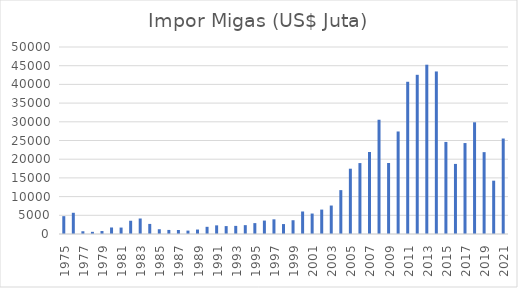
| Category | Impor Migas (US$ Juta) |
|---|---|
| 1975.0 | 4769.8 |
| 1976.0 | 5673.1 |
| 1977.0 | 732 |
| 1978.0 | 579.7 |
| 1979.0 | 793.3 |
| 1980.0 | 1744 |
| 1981.0 | 1721.3 |
| 1982.0 | 3544.8 |
| 1983.0 | 4144.8 |
| 1984.0 | 2696.8 |
| 1985.0 | 1275.6 |
| 1986.0 | 1086.4 |
| 1987.0 | 1067.9 |
| 1988.0 | 909 |
| 1989.0 | 1195.2 |
| 1990.0 | 1920.4 |
| 1991.0 | 2310.3 |
| 1992.0 | 2115 |
| 1993.0 | 2170.5 |
| 1994.0 | 2367.2 |
| 1995.0 | 2910.8 |
| 1996.0 | 3589.7 |
| 1997.0 | 3924.1 |
| 1998.0 | 2653.7 |
| 1999.0 | 3681.1 |
| 2000.0 | 6019.5 |
| 2001.0 | 5471.8 |
| 2002.0 | 6525.8 |
| 2003.0 | 7610.9 |
| 2004.0 | 11732 |
| 2005.0 | 17457.7 |
| 2006.0 | 18962.9 |
| 2007.0 | 21932.8 |
| 2008.0 | 30552.9 |
| 2009.0 | 18980.7 |
| 2010.0 | 27412.7 |
| 2011.0 | 40701.6 |
| 2012.0 | 42564.4 |
| 2013.0 | 45266.4 |
| 2014.0 | 43459.9 |
| 2015.0 | 24613.1 |
| 2016.0 | 18739.4 |
| 2017.0 | 24316.2 |
| 2018.0 | 29868.8 |
| 2019.0 | 21885.3 |
| 2020.0 | 14256.8 |
| 2021.0 | 25529.1 |